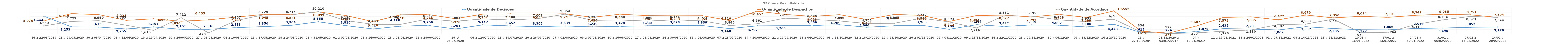
| Category | Quantidade de Decisões | Quantidade de Despachos | Quantidade de Acórdãos |
|---|---|---|---|
| 16 a 22/03/2019 | 8133 | 5975 | 3650 |
| 23 a 29/03/2020 | 3253 | 9319 | 5725 |
| 30 a 05/04/2020 | 3163 | 8857 | 6060 |
| 06 a 12/04/2020 | 2255 | 6228 | 3995 |
| 13 a 19/04/2020 | 3197 | 6930 | 1610 |
| 20 a 26/04/2020 | 2101 | 5836 | 7412 |
| 27 a 03/05/2020 | 2136 | 6455 | 493 |
| 04 a 10/05/2020 | 2883 | 7705 | 6107 |
| 11 a 17/05/2020 | 3350 | 8945 | 8726 |
| 18 a 24/05/2020 | 3904 | 8881 | 8715 |
| 25 a 31/05/2020 | 5555 | 10099 | 10210 |
| 01 a 07/06/2020 | 3816 | 8459 | 6126 |
| 08 a 14/06/2020 | 2261 | 5648 | 4403 |
| 15 a 21/06/2020 | 3566 | 8749 | 4380 |
| 22 a 28/06/2020 | 3900 | 8918 | 6847 |
| 29  A 05/07/2020 | 2261 | 6978 | 5807 |
| 06 a 12/07/2020 | 4159 | 9107 | 6870 |
| 13 a 19/07/2020 | 3652 | 9195 | 6408 |
| 20 a 26/07/2020 | 3362 | 9080 | 7007 |
| 27 a 02/08/2020 | 3634 | 9241 | 9054 |
| 03 a 09/08/2020 | 3230 | 7620 | 6220 |
| 10 a 16/08/2020 | 3470 | 9045 | 6380 |
| 17 a 23/08/2020 | 3718 | 8402 | 5886 |
| 24 a 30/08/2020 | 3898 | 8288 | 6466 |
| 31 a 06/09/2020 | 3839 | 8353 | 5973 |
| 07 a 13/09/2020 | 2440 | 6116 | 3846 |
| 14 a 20/09/2020 | 3707 | 10457 | 4661 |
| 21 a 27/09/2020 | 3760 | 8960 | 7226 |
| 28 a 04/10/2020 | 3869 | 8023 | 6670 |
| 05 a 11/10/2020 | 4209 | 8840 | 5952 |
| 12 a 18/10/2020 | 3066 | 6594 | 4753 |
| 19 a 25/10/2020 | 3736 | 8945 | 4900 |
| 26 a 01/11/2020 | 3980 | 8519 | 7217 |
| 02 a 08/11/2020 | 2109 | 5712 | 5493 |
| 09 a 15/11/2020 | 4244 | 8450 | 2714 |
| 16 a 22/11/2020 | 3422 | 8627 | 8331 |
| 23 a 29/11/2020 | 4119 | 7792 | 8195 |
| 30 a 06/12/20 | 4002 | 8968 | 6428 |
| 07 a 13/12/2020 | 3180 | 7599 | 5653 |
| 14 a 20/12/2020 | 4443 | 10556 | 6763 |
| 21 a 27/12/2020* | 615 | 1278 | 834 |
| 28/12/2020 a 03/01/2021* | 294 | 373 | 177 |
| 04 a 10/01/2021* | 1075 | 3607 | 472 |
| 11 a 17/01/2021 | 2435 | 7575 | 1226 |
| 18 a 24/01/2021 | 2231 | 7835 | 1830 |
| 01 a 07/11/2021 | 1809 | 6477 | 4302 |
| 08 a 14/11/2021 | 3312 | 8679 | 4503 |
| 15 a 21/11/2021 | 2485 | 7350 | 6776 |
| 10/01 a 16/01/2022 | 1927 | 8074 | 579 |
| 17/01 a 23/01/2022 | 1866 | 7601 | 764 |
| 24/01 a 30/01/2022 | 2512 | 8547 | 4318 |
| 31/01 a 06/02/2022 | 2690 | 9035 | 6446 |
| 07/02 a 13/02/2022 | 3052 | 8751 | 8023 |
| 14/02 a 20/02/2022 | 3176 | 7594 | 7594 |